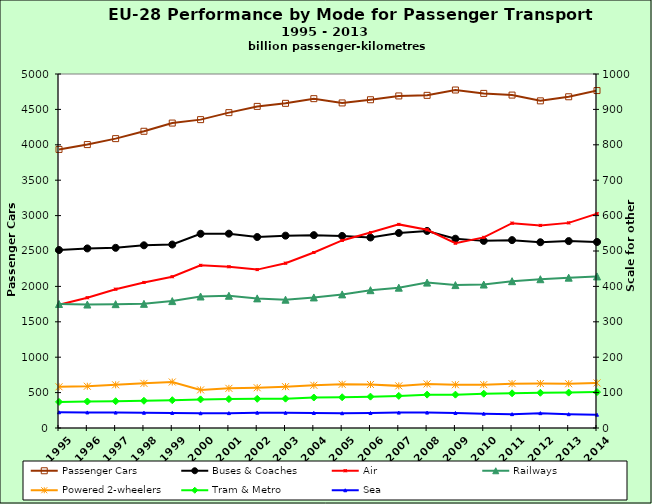
| Category | Passenger Cars |
|---|---|
| 1995.0 | 3934.847 |
| 1996.0 | 4002.989 |
| 1997.0 | 4087.17 |
| 1998.0 | 4191.022 |
| 1999.0 | 4306.813 |
| 2000.0 | 4355.421 |
| 2001.0 | 4454.198 |
| 2002.0 | 4542.342 |
| 2003.0 | 4585.563 |
| 2004.0 | 4651.571 |
| 2005.0 | 4591.316 |
| 2006.0 | 4636.352 |
| 2007.0 | 4690.039 |
| 2008.0 | 4698.435 |
| 2009.0 | 4773.794 |
| 2010.0 | 4725.915 |
| 2011.0 | 4702.149 |
| 2012.0 | 4620.821 |
| 2013.0 | 4678.397 |
| 2014.0 | 4766.478 |